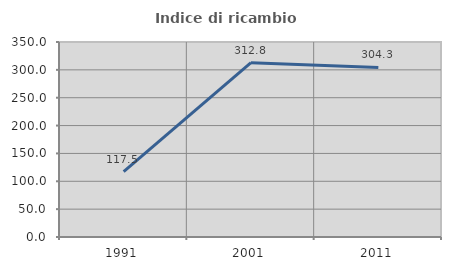
| Category | Indice di ricambio occupazionale  |
|---|---|
| 1991.0 | 117.483 |
| 2001.0 | 312.821 |
| 2011.0 | 304.348 |